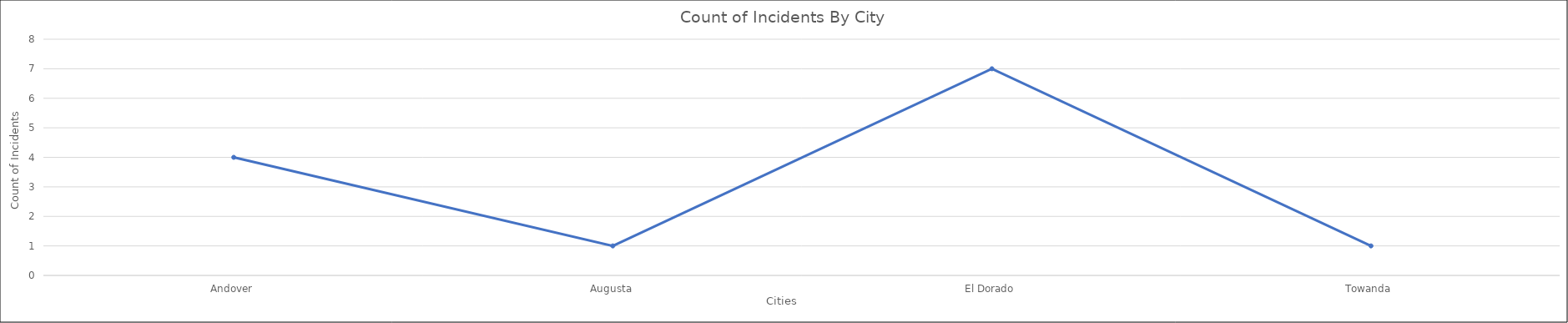
| Category | Total |
|---|---|
| Andover | 4 |
| Augusta | 1 |
| El Dorado | 7 |
| Towanda | 1 |